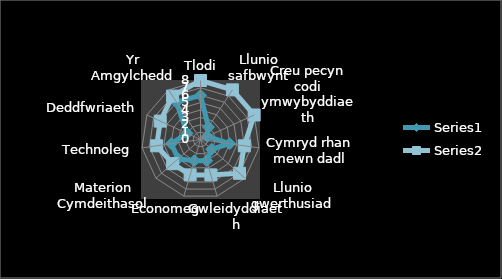
| Category | Series 0 | Series 1 |
|---|---|---|
|  Tlodi | 6 | 8 |
| Llunio safbwynt | 2 | 8 |
| Creu pecyn codi ymwybyddiaeth | 1 | 8 |
| Cymryd rhan mewn dadl | 4 | 6 |
| Llunio gwerthusiad | 2 | 7 |
| Gwleidyddiaeth | 3 | 5 |
| Economeg | 3 | 5 |
| Materion Cymdeithasol | 4 | 5 |
| Technoleg | 4 | 6 |
| Deddfwriaeth | 2 | 6 |
| Yr Amgylchedd | 6 | 7 |